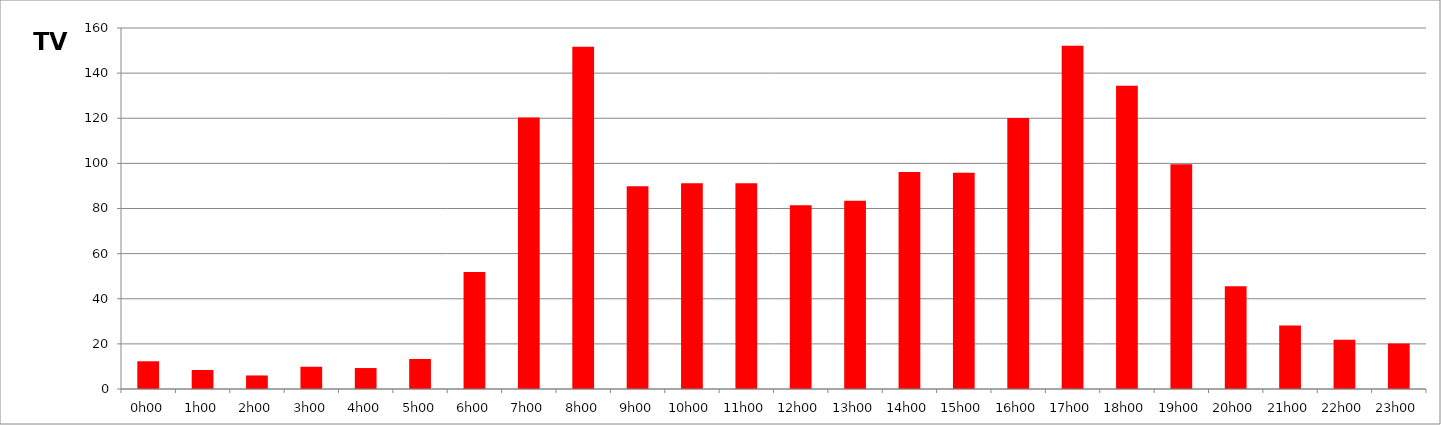
| Category | TV |
|---|---|
| 0.0 | 12.286 |
| 0.041666666666666664 | 8.429 |
| 0.08333333333333333 | 6 |
| 0.125 | 9.857 |
| 0.16666666666666666 | 9.286 |
| 0.20833333333333334 | 13.286 |
| 0.25 | 51.857 |
| 0.2916666666666667 | 120.286 |
| 0.3333333333333333 | 151.714 |
| 0.375 | 89.857 |
| 0.4166666666666667 | 91.143 |
| 0.4583333333333333 | 91.143 |
| 0.5 | 81.429 |
| 0.5416666666666666 | 83.429 |
| 0.5833333333333334 | 96.143 |
| 0.625 | 95.857 |
| 0.6666666666666666 | 120.143 |
| 0.7083333333333334 | 152.143 |
| 0.75 | 134.429 |
| 0.7916666666666666 | 99.571 |
| 0.8333333333333334 | 45.571 |
| 0.875 | 28.143 |
| 0.9166666666666666 | 21.857 |
| 0.9583333333333334 | 20.143 |